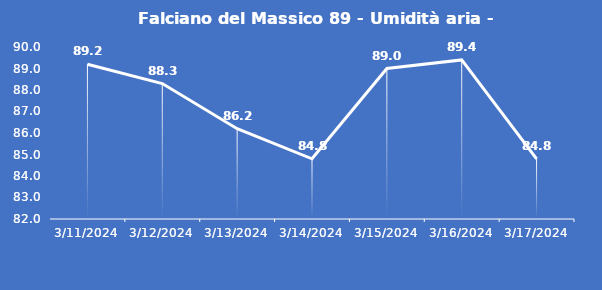
| Category | Falciano del Massico 89 - Umidità aria - Grezzo (%) |
|---|---|
| 3/11/24 | 89.2 |
| 3/12/24 | 88.3 |
| 3/13/24 | 86.2 |
| 3/14/24 | 84.8 |
| 3/15/24 | 89 |
| 3/16/24 | 89.4 |
| 3/17/24 | 84.8 |